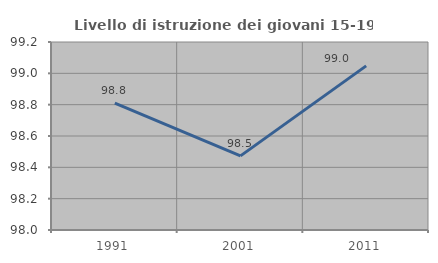
| Category | Livello di istruzione dei giovani 15-19 anni |
|---|---|
| 1991.0 | 98.81 |
| 2001.0 | 98.473 |
| 2011.0 | 99.048 |